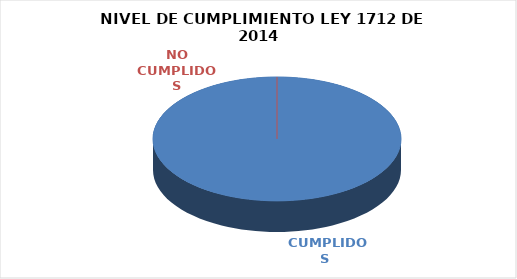
| Category | Series 0 |
|---|---|
|  CUMPLIDOS | 115 |
| NO CUMPLIDOS | 0 |